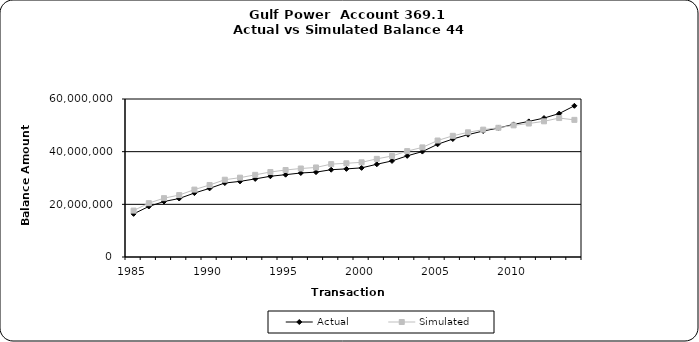
| Category | Actual | Simulated |
|---|---|---|
| 1985.0 | 16382238.12 | 17619364.162 |
| 1986.0 | 19187616.12 | 20452878.521 |
| 1987.0 | 21069907.32 | 22346124.648 |
| 1988.0 | 22209693.03 | 23515881.768 |
| 1989.0 | 24284458.03 | 25595952.617 |
| 1990.0 | 26064781.03 | 27344709.576 |
| 1991.0 | 28086075.03 | 29346785.848 |
| 1992.0 | 28714738.58 | 30125828.906 |
| 1993.0 | 29651323.05 | 31202008.034 |
| 1994.0 | 30658889.61 | 32284050.365 |
| 1995.0 | 31259081.52 | 33036353.917 |
| 1996.0 | 31898889.66 | 33606949.172 |
| 1997.0 | 32230915.66 | 34001486.838 |
| 1998.0 | 33145486.66 | 35272176.237 |
| 1999.0 | 33463711.66 | 35586484.698 |
| 2000.0 | 33846214.66 | 35955955.897 |
| 2001.0 | 35218963.73 | 37264966.809 |
| 2002.0 | 36481528.43 | 38353351.543 |
| 2003.0 | 38412477.23 | 40214272.012 |
| 2004.0 | 40035393.36 | 41623759.449 |
| 2005.0 | 42804558.36 | 44236986.301 |
| 2006.0 | 44800197.36 | 46020491.346 |
| 2007.0 | 46455537.36 | 47345372.221 |
| 2008.0 | 47847538.36 | 48361436.393 |
| 2009.0 | 48970585.29 | 49066688.23 |
| 2010.0 | 50352811.48 | 49990774.974 |
| 2011.0 | 51498379.04 | 50687813.995 |
| 2012.0 | 52762456.31 | 51523344.268 |
| 2013.0 | 54467608.85 | 52762745.18 |
| 2014.0 | 57418874.3 | 52075292.673 |